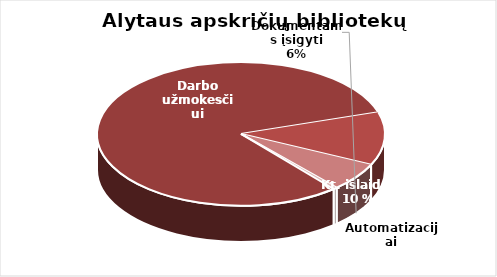
| Category | Series 0 |
|---|---|
| Darbo užmokesčiui | 2506077.03 |
| Kitos | 367839.5 |
| Dokumentams įsigyti | 197115.97 |
| Automatizacijai | 13646.05 |